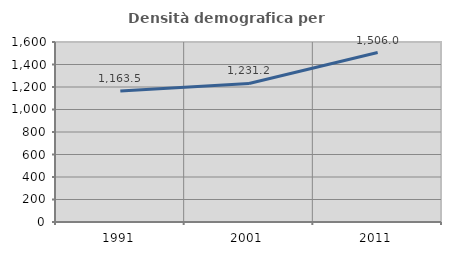
| Category | Densità demografica |
|---|---|
| 1991.0 | 1163.52 |
| 2001.0 | 1231.198 |
| 2011.0 | 1506.035 |